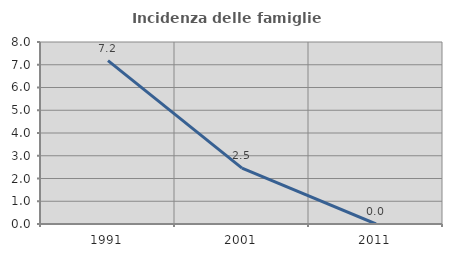
| Category | Incidenza delle famiglie numerose |
|---|---|
| 1991.0 | 7.179 |
| 2001.0 | 2.455 |
| 2011.0 | 0 |